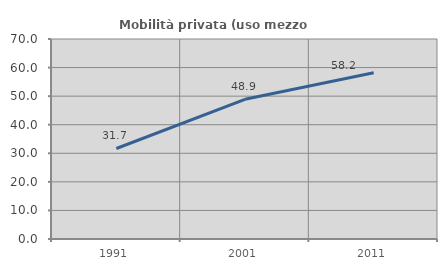
| Category | Mobilità privata (uso mezzo privato) |
|---|---|
| 1991.0 | 31.684 |
| 2001.0 | 48.889 |
| 2011.0 | 58.2 |